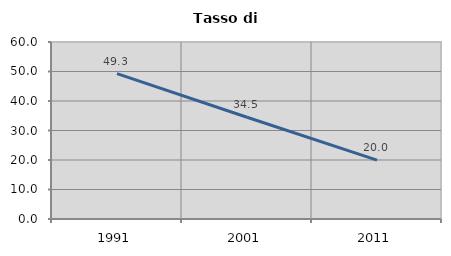
| Category | Tasso di disoccupazione   |
|---|---|
| 1991.0 | 49.296 |
| 2001.0 | 34.49 |
| 2011.0 | 19.951 |